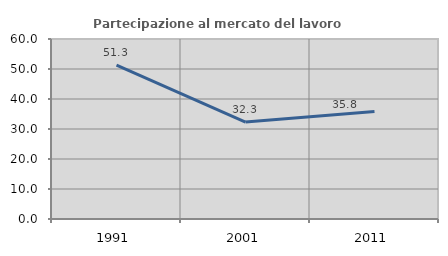
| Category | Partecipazione al mercato del lavoro  femminile |
|---|---|
| 1991.0 | 51.272 |
| 2001.0 | 32.296 |
| 2011.0 | 35.837 |